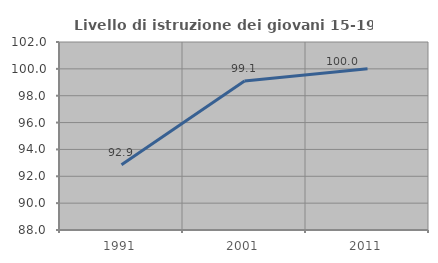
| Category | Livello di istruzione dei giovani 15-19 anni |
|---|---|
| 1991.0 | 92.857 |
| 2001.0 | 99.099 |
| 2011.0 | 100 |